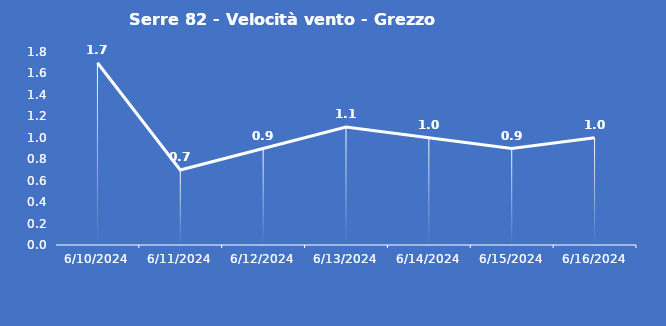
| Category | Serre 82 - Velocità vento - Grezzo (m/s) |
|---|---|
| 6/10/24 | 1.7 |
| 6/11/24 | 0.7 |
| 6/12/24 | 0.9 |
| 6/13/24 | 1.1 |
| 6/14/24 | 1 |
| 6/15/24 | 0.9 |
| 6/16/24 | 1 |